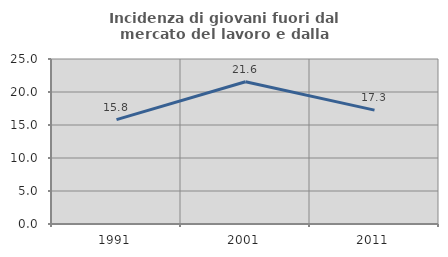
| Category | Incidenza di giovani fuori dal mercato del lavoro e dalla formazione  |
|---|---|
| 1991.0 | 15.813 |
| 2001.0 | 21.552 |
| 2011.0 | 17.25 |